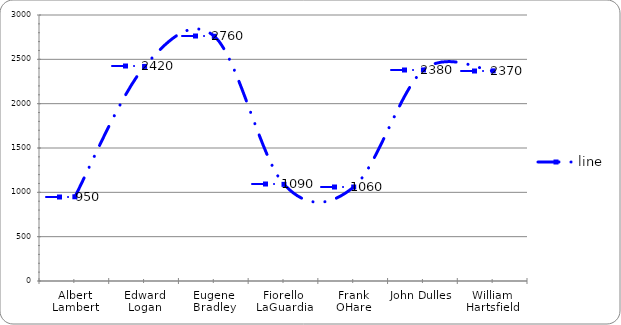
| Category | line |
|---|---|
| Albert Lambert | 950 |
| Edward Logan | 2420 |
| Eugene Bradley | 2760 |
| Fiorello LaGuardia | 1090 |
| Frank OHare | 1060 |
| John Dulles | 2380 |
| William Hartsfield | 2370 |